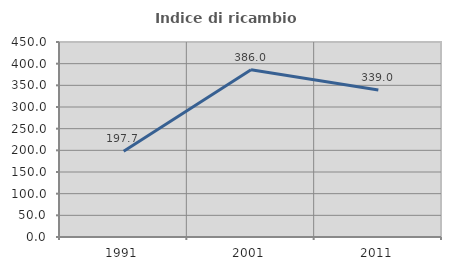
| Category | Indice di ricambio occupazionale  |
|---|---|
| 1991.0 | 197.656 |
| 2001.0 | 386.022 |
| 2011.0 | 339.041 |